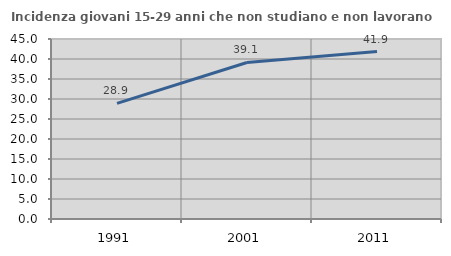
| Category | Incidenza giovani 15-29 anni che non studiano e non lavorano  |
|---|---|
| 1991.0 | 28.899 |
| 2001.0 | 39.13 |
| 2011.0 | 41.86 |